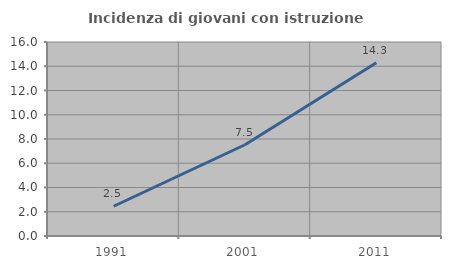
| Category | Incidenza di giovani con istruzione universitaria |
|---|---|
| 1991.0 | 2.454 |
| 2001.0 | 7.527 |
| 2011.0 | 14.286 |